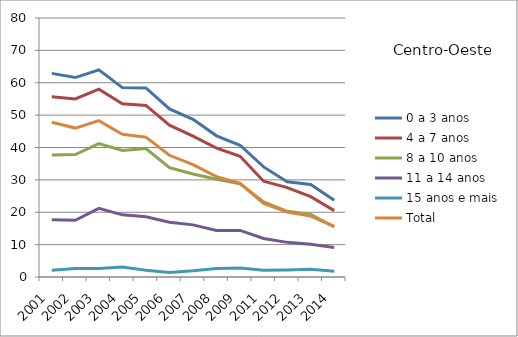
| Category | 0 a 3 anos | 4 a 7 anos | 8 a 10 anos | 11 a 14 anos | 15 anos e mais | Total |
|---|---|---|---|---|---|---|
| 2001.0 | 62.9 | 55.7 | 37.7 | 17.7 | 2.1 | 47.8 |
| 2002.0 | 61.6 | 55 | 37.8 | 17.5 | 2.6 | 46 |
| 2003.0 | 64 | 58 | 41.2 | 21.2 | 2.6 | 48.3 |
| 2004.0 | 58.5 | 53.5 | 39.1 | 19.2 | 3.1 | 44.1 |
| 2005.0 | 58.4 | 53 | 39.7 | 18.6 | 2.1 | 43.2 |
| 2006.0 | 51.9 | 46.9 | 33.8 | 16.9 | 1.4 | 37.6 |
| 2007.0 | 48.7 | 43.5 | 31.8 | 16.1 | 1.9 | 34.7 |
| 2008.0 | 43.6 | 39.8 | 30.2 | 14.4 | 2.6 | 31 |
| 2009.0 | 40.7 | 37.3 | 28.8 | 14.4 | 2.8 | 28.9 |
| 2011.0 | 34 | 29.6 | 23.2 | 11.9 | 2.1 | 22.7 |
| 2012.0 | 29.4 | 27.6 | 20.3 | 10.7 | 2.2 | 20.1 |
| 2013.0 | 28.6 | 24.8 | 19.3 | 10.1 | 2.4 | 18.8 |
| 2014.0 | 23.7 | 20.5 | 15.5 | 9.1 | 1.8 | 15.6 |